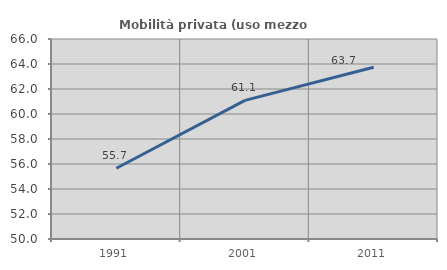
| Category | Mobilità privata (uso mezzo privato) |
|---|---|
| 1991.0 | 55.662 |
| 2001.0 | 61.092 |
| 2011.0 | 63.742 |